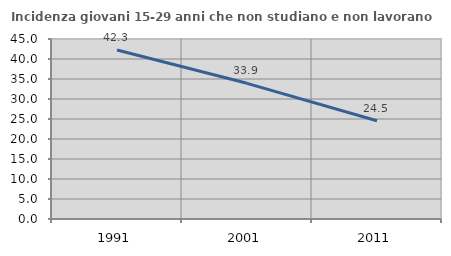
| Category | Incidenza giovani 15-29 anni che non studiano e non lavorano  |
|---|---|
| 1991.0 | 42.258 |
| 2001.0 | 33.92 |
| 2011.0 | 24.547 |